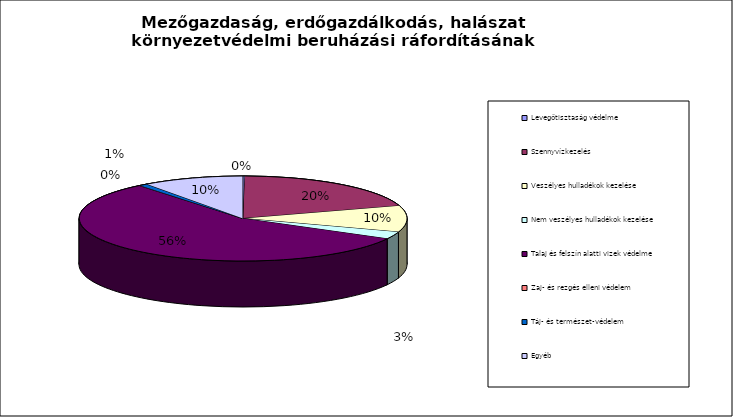
| Category | Series 0 |
|---|---|
| Levegőtisztaság védelme | 6.366 |
| Szennyvízkezelés | 638.871 |
| Veszélyes hulladékok kezelése | 319.288 |
| Nem veszélyes hulladékok kezelése | 87.933 |
| Talaj és felszín alatti vizek védelme | 1796.159 |
| Zaj- és rezgés elleni védelem | 3.793 |
| Táj- és természet-védelem | 25.138 |
| Egyéb | 319.43 |